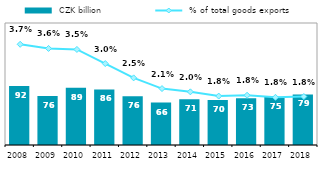
| Category |  CZK billion |
|---|---|
| 2008.0 | 91.879 |
| 2009.0 | 76.171 |
| 2010.0 | 89.274 |
| 2011.0 | 86.46 |
| 2012.0 | 76.073 |
| 2013.0 | 66.078 |
| 2014.0 | 71.144 |
| 2015.0 | 70.087 |
| 2016.0 | 72.922 |
| 2017.0 | 74.65 |
| 2018.0 | 78.676 |